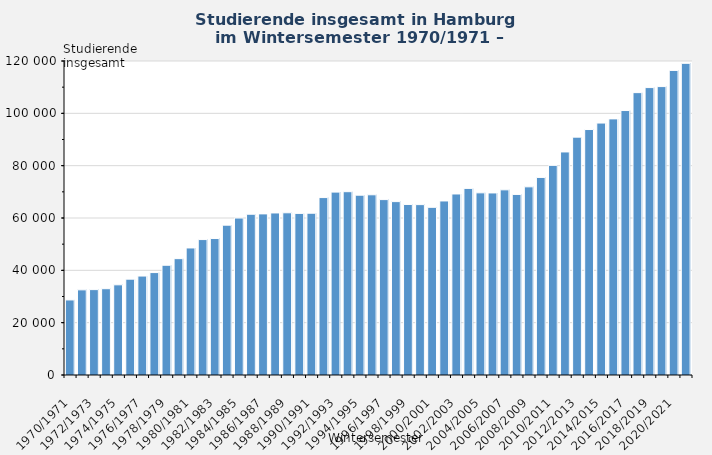
| Category | Studierende insgesamt |
|---|---|
| 1970/1971 | 28686 |
| 1971/1972 | 32538 |
| 1972/1973 | 32631 |
| 1973/1974 | 32976 |
| 1974/1975 | 34461 |
| 1975/1976 | 36633 |
| 1976/1977 | 37815 |
| 1977/1978 | 39147 |
| 1978/1979 | 41937 |
| 1979/1980 | 44463 |
| 1980/1981 | 48552 |
| 1981/1982 | 51759 |
| 1982/1983 | 52152 |
| 1983/1984 | 57264 |
| 1984/1985 | 59994 |
| 1985/1986 | 61443 |
| 1986/1987 | 61575 |
| 1987/1988 | 61926 |
| 1988/1989 | 61992 |
| 1989/1990 | 61764 |
| 1990/1991 | 61827 |
| 1991/1992 | 67806 |
| 1992/1993 | 69891 |
| 1993/1994 | 70053 |
| 1994/1995 | 68721 |
| 1995/1996 | 68868 |
| 1996/1997 | 67032 |
| 1997/1998 | 66261 |
| 1998/1999 | 65175 |
| 1999/2000 | 65115 |
| 2000/2001 | 64083 |
| 2001/2002 | 66513 |
| 2002/2003 | 69180 |
| 2003/2004 | 71319 |
| 2004/2005 | 69618 |
| 2005/2006 | 69573 |
| 2006/2007 | 70761 |
| 2007/2008 | 69009 |
| 2008/2009 | 71910 |
| 2009/2010 | 75513 |
| 2010/2011 | 80115 |
| 2011/2012 | 85242 |
| 2012/2013 | 90903 |
| 2013/2014 | 93813 |
| 2014/2015 | 96285 |
| 2015/2016 | 97881 |
| 2016/2017 | 101070 |
| 2017/2018 | 107913 |
| 2018/2019 | 109842 |
| 2019/2020 | 110220 |
| 2020/2021 | 116394 |
| 2021/2022 | 119112 |